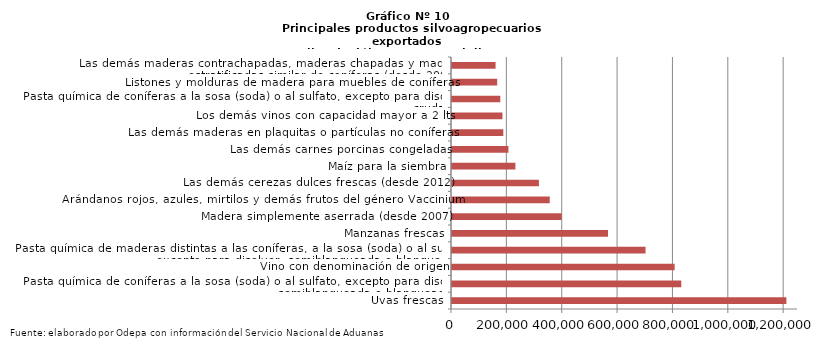
| Category | Series 0 |
|---|---|
| Uvas frescas | 1208097.007 |
| Pasta química de coníferas a la sosa (soda) o al sulfato, excepto para disolver, semiblanqueada o blanqueada | 828215.186 |
| Vino con denominación de origen | 804363.312 |
| Pasta química de maderas distintas a las coníferas, a la sosa (soda) o al sulfato, excepto para disolver, semiblanqueada o blanqueada | 699196.213 |
| Manzanas frescas | 563567.182 |
| Madera simplemente aserrada (desde 2007) | 396365.202 |
| Arándanos rojos, azules, mirtilos y demás frutos del género Vaccinium | 353115.924 |
| Las demás cerezas dulces frescas (desde 2012) | 313959.61 |
| Maíz para la siembra | 229018.115 |
| Las demás carnes porcinas congeladas | 203889.261 |
| Las demás maderas en plaquitas o partículas no coníferas | 185418.879 |
| Los demás vinos con capacidad mayor a 2 lts | 182310.697 |
| Pasta química de coníferas a la sosa (soda) o al sulfato, excepto para disolver, cruda | 174468.572 |
| Listones y molduras de madera para muebles de coníferas | 163291.64 |
| Las demás maderas contrachapadas, maderas chapadas y maderas estratificadas similar de coníferas (desde 2007) | 157390.926 |